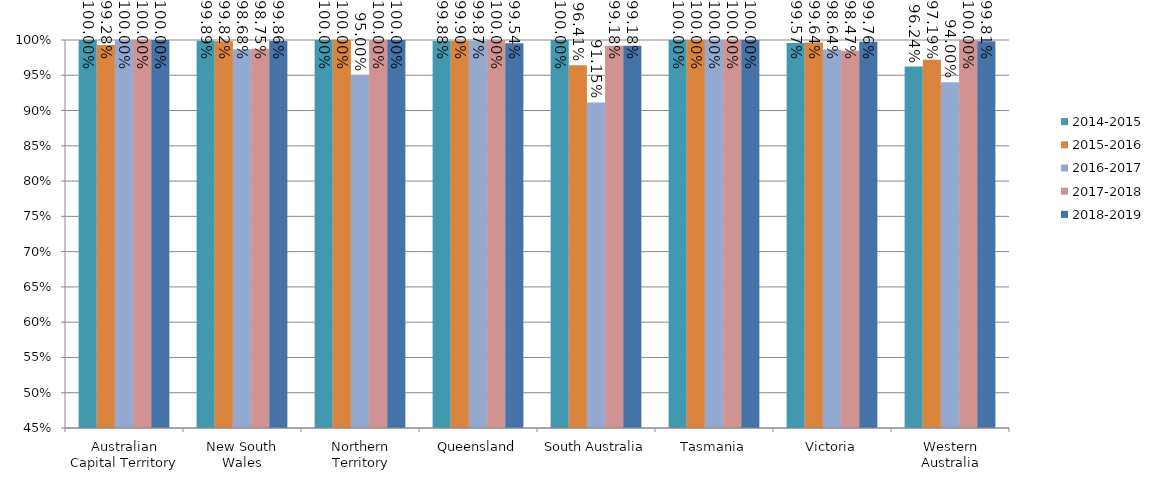
| Category | 2014-2015 | 2015-2016 | 2016-2017 | 2017-2018 | 2018-2019 |
|---|---|---|---|---|---|
| Australian Capital Territory | 1 | 0.993 | 1 | 1 | 1 |
| New South Wales | 0.999 | 0.998 | 0.987 | 0.987 | 0.999 |
| Northern Territory | 1 | 1 | 0.95 | 1 | 1 |
| Queensland | 0.999 | 0.999 | 0.999 | 1 | 0.995 |
| South Australia | 1 | 0.964 | 0.912 | 0.992 | 0.992 |
| Tasmania | 1 | 1 | 1 | 1 | 1 |
| Victoria | 0.996 | 0.996 | 0.986 | 0.985 | 0.998 |
| Western Australia | 0.962 | 0.972 | 0.94 | 1 | 0.998 |